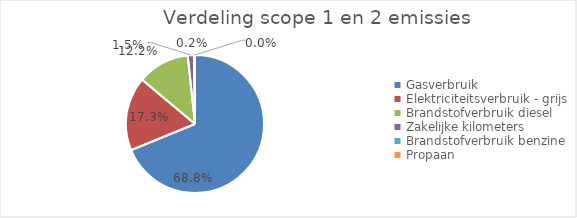
| Category | categorie |
|---|---|
| Gasverbruik | 1209.878 |
| Elektriciteitsverbruik - grijs | 303.853 |
| Brandstofverbruik diesel | 214.674 |
| Zakelijke kilometers | 25.472 |
| Brandstofverbruik benzine | 3.824 |
| Propaan | 0.493 |